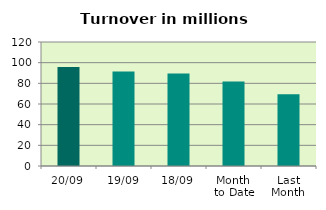
| Category | Series 0 |
|---|---|
| 20/09 | 95.808 |
| 19/09 | 91.509 |
| 18/09 | 89.582 |
| Month 
to Date | 81.871 |
| Last
Month | 69.378 |